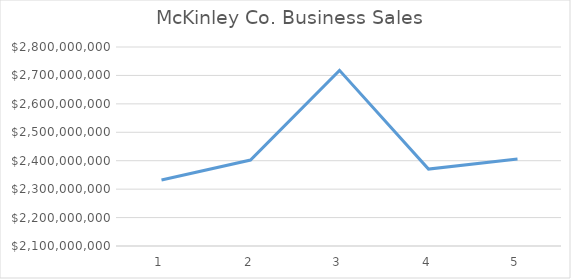
| Category | Series 0 |
|---|---|
| 0 | 2332106933.362 |
| 1 | 2402453927.599 |
| 2 | 2717943694.372 |
| 3 | 2370522748.827 |
| 4 | 2405652249.059 |